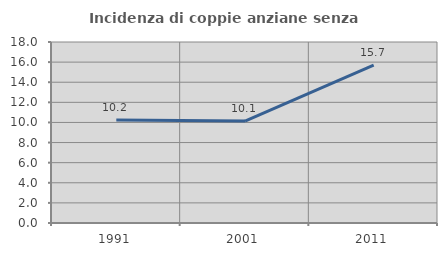
| Category | Incidenza di coppie anziane senza figli  |
|---|---|
| 1991.0 | 10.247 |
| 2001.0 | 10.135 |
| 2011.0 | 15.698 |